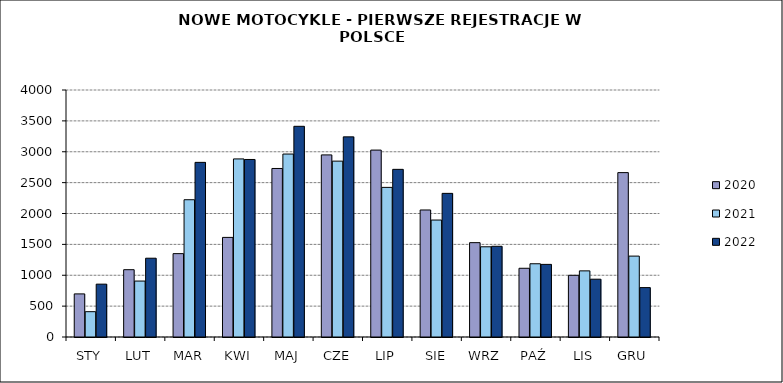
| Category | 2020 | 2021 | 2022 |
|---|---|---|---|
|  STY  | 698 | 410 | 856 |
|  LUT  | 1090 | 906 | 1276 |
| MAR | 1350 | 2223 | 2828 |
| KWI | 1613 | 2884 | 2875 |
| MAJ | 2729 | 2963 | 3412 |
| CZE | 2949 | 2848 | 3241 |
| LIP | 3027 | 2423 | 2715 |
| SIE | 2057 | 1894 | 2326 |
| WRZ | 1528 | 1461 | 1469 |
| PAŹ | 1113 | 1186 | 1176 |
| LIS | 999 | 1071 | 936 |
| GRU | 2662 | 1310 | 800 |